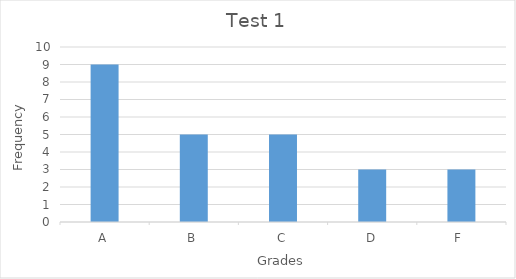
| Category | Frequency |
|---|---|
| A | 9 |
| B | 5 |
| C | 5 |
| D | 3 |
| F  | 3 |